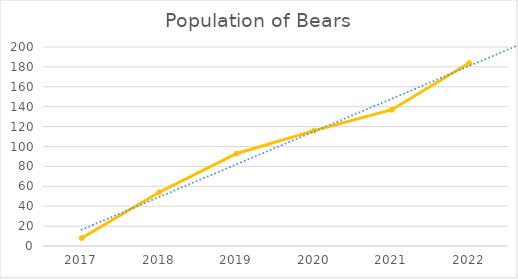
| Category | Bears |
|---|---|
| 2017.0 | 8 |
| 2018.0 | 54 |
| 2019.0 | 93 |
| 2020.0 | 116 |
| 2021.0 | 137 |
| 2022.0 | 184 |